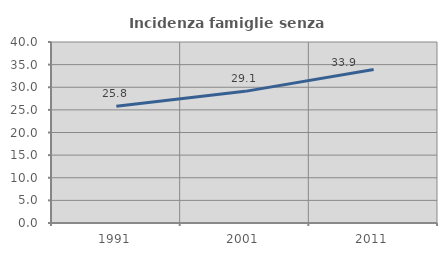
| Category | Incidenza famiglie senza nuclei |
|---|---|
| 1991.0 | 25.823 |
| 2001.0 | 29.091 |
| 2011.0 | 33.902 |